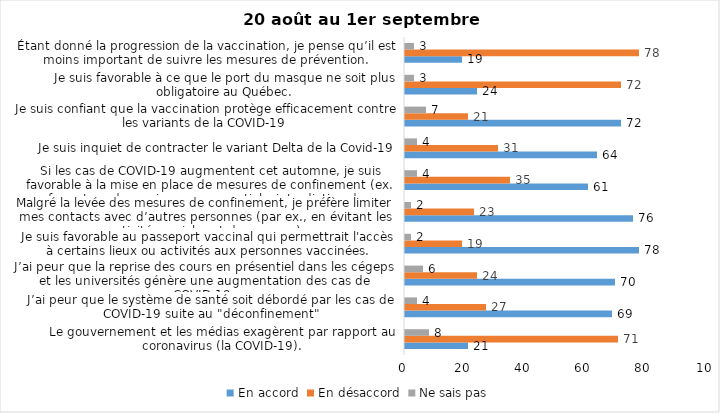
| Category | En accord | En désaccord | Ne sais pas |
|---|---|---|---|
| Le gouvernement et les médias exagèrent par rapport au coronavirus (la COVID-19). | 21 | 71 | 8 |
| J’ai peur que le système de santé soit débordé par les cas de COVID-19 suite au "déconfinement" | 69 | 27 | 4 |
| J’ai peur que la reprise des cours en présentiel dans les cégeps et les universités génère une augmentation des cas de COVID-19. | 70 | 24 | 6 |
| Je suis favorable au passeport vaccinal qui permettrait l'accès à certains lieux ou activités aux personnes vaccinées. | 78 | 19 | 2 |
| Malgré la levée des mesures de confinement, je préfère limiter mes contacts avec d’autres personnes (par ex., en évitant les activités sociales et de groupes) | 76 | 23 | 2 |
| Si les cas de COVID-19 augmentent cet automne, je suis favorable à la mise en place de mesures de confinement (ex. fermeture de services non essentiels, interdiction des rassemblements privés) | 61 | 35 | 4 |
| Je suis inquiet de contracter le variant Delta de la Covid-19 | 64 | 31 | 4 |
| Je suis confiant que la vaccination protège efficacement contre les variants de la COVID-19 | 72 | 21 | 7 |
| Je suis favorable à ce que le port du masque ne soit plus obligatoire au Québec. | 24 | 72 | 3 |
| Étant donné la progression de la vaccination, je pense qu’il est moins important de suivre les mesures de prévention. | 19 | 78 | 3 |